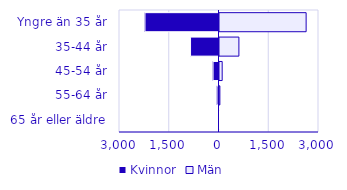
| Category | Kvinnor | Män |
|---|---|---|
| 0 | -2232 | 2612 |
| 1 | -858 | 585 |
| 2 | -179 | 81 |
| 3 | -60 | 11 |
| 4 | -4 | 0 |